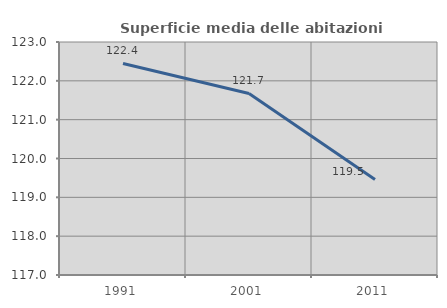
| Category | Superficie media delle abitazioni occupate |
|---|---|
| 1991.0 | 122.448 |
| 2001.0 | 121.674 |
| 2011.0 | 119.461 |